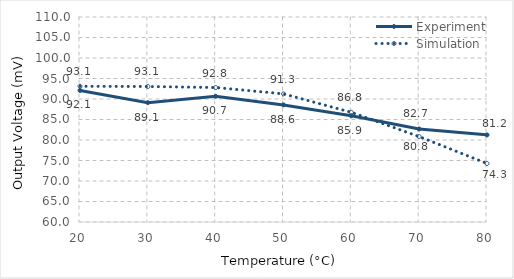
| Category | Experiment | Simulation |
|---|---|---|
| 20.0 | 92.081 | 93.1 |
| 30.0 | 89.116 | 93.05 |
| 40.0 | 90.66 | 92.8 |
| 50.0 | 88.556 | 91.25 |
| 60.0 | 85.899 | 86.75 |
| 70.0 | 82.686 | 80.83 |
| 80.0 | 81.237 | 74.27 |